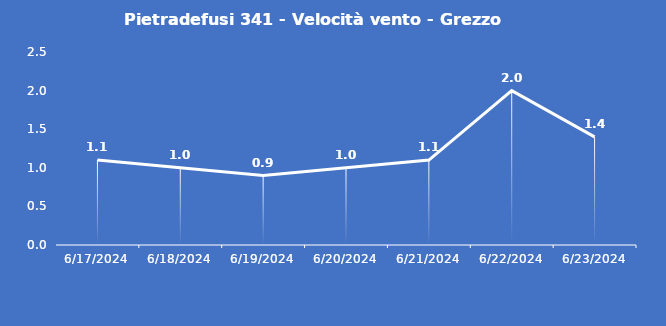
| Category | Pietradefusi 341 - Velocità vento - Grezzo (m/s) |
|---|---|
| 6/17/24 | 1.1 |
| 6/18/24 | 1 |
| 6/19/24 | 0.9 |
| 6/20/24 | 1 |
| 6/21/24 | 1.1 |
| 6/22/24 | 2 |
| 6/23/24 | 1.4 |